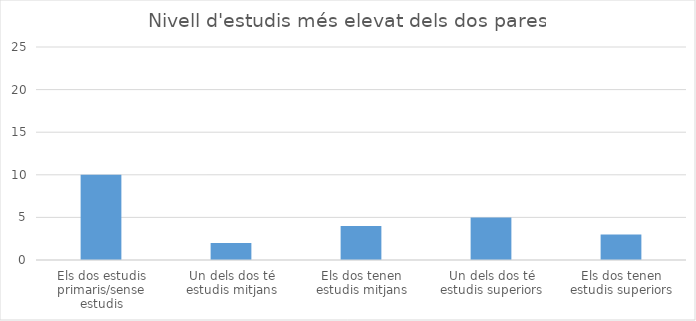
| Category | Series 0 |
|---|---|
| Els dos estudis primaris/sense estudis | 10 |
| Un dels dos té estudis mitjans | 2 |
| Els dos tenen estudis mitjans | 4 |
| Un dels dos té estudis superiors | 5 |
| Els dos tenen estudis superiors | 3 |